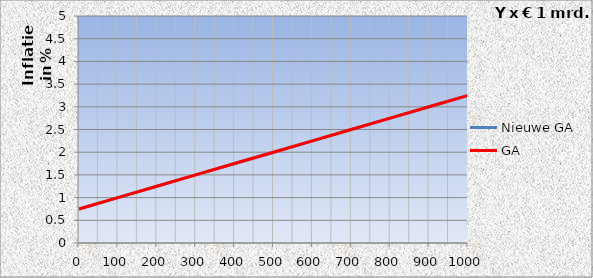
| Category | Nieuwe GA | GA |
|---|---|---|
| 0.0 | 0.75 | 0.75 |
| 100.0 | 1 | 1 |
| 200.0 | 1.25 | 1.25 |
| 300.0 | 1.5 | 1.5 |
| 400.0 | 1.75 | 1.75 |
| 500.0 | 2 | 2 |
| 600.0 | 2.25 | 2.25 |
| 700.0 | 2.5 | 2.5 |
| 800.0 | 2.75 | 2.75 |
| 900.0 | 3 | 3 |
| 1000.0 | 3.25 | 3.25 |